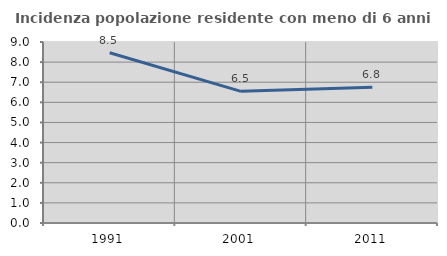
| Category | Incidenza popolazione residente con meno di 6 anni |
|---|---|
| 1991.0 | 8.468 |
| 2001.0 | 6.546 |
| 2011.0 | 6.752 |